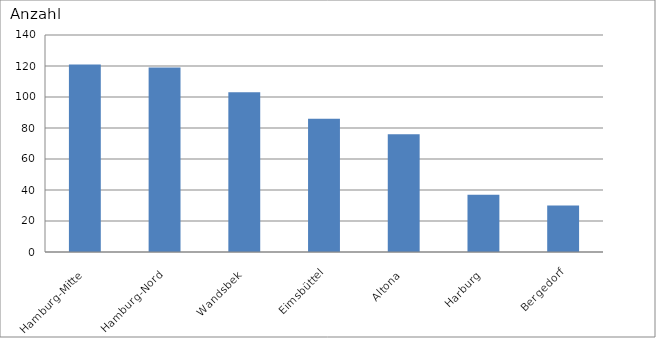
| Category | Hamburg-Mitte |
|---|---|
| Hamburg-Mitte | 121 |
| Hamburg-Nord | 119 |
| Wandsbek | 103 |
| Eimsbüttel | 86 |
| Altona | 76 |
| Harburg | 37 |
| Bergedorf | 30 |